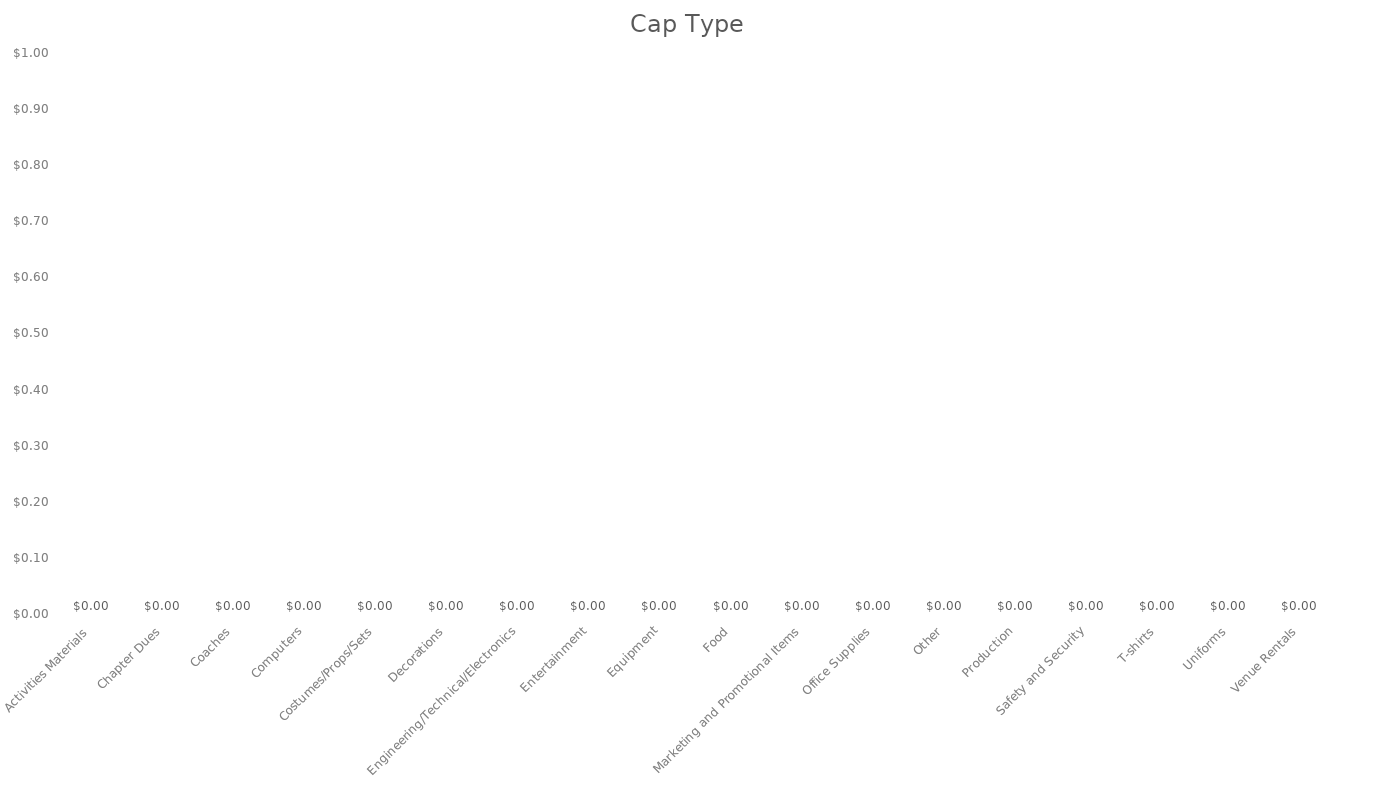
| Category | Cap Type |
|---|---|
| Activities Materials | 0 |
| Chapter Dues | 0 |
| Coaches | 0 |
| Computers | 0 |
| Costumes/Props/Sets | 0 |
| Decorations | 0 |
| Engineering/Technical/Electronics | 0 |
| Entertainment | 0 |
| Equipment | 0 |
| Food | 0 |
| Marketing and Promotional Items | 0 |
| Office Supplies | 0 |
| Other | 0 |
| Production | 0 |
| Safety and Security | 0 |
| T-shirts | 0 |
| Uniforms | 0 |
| Venue Rentals | 0 |